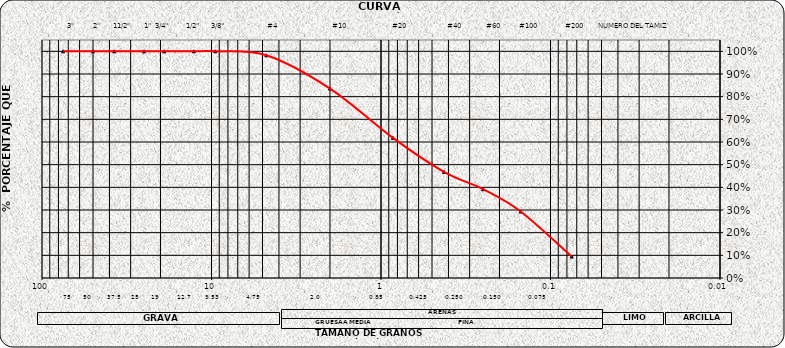
| Category | Series 0 |
|---|---|
| 75.0 | 1 |
| 50.0 | 1 |
| 37.5 | 1 |
| 25.0 | 1 |
| 19.0 | 1 |
| 12.7 | 1 |
| 9.5 | 1 |
| 4.75 | 0.982 |
| 2.0 | 0.836 |
| 0.85 | 0.618 |
| 0.425 | 0.468 |
| 0.25 | 0.392 |
| 0.15 | 0.293 |
| 0.075 | 0.095 |
| nan | 0 |